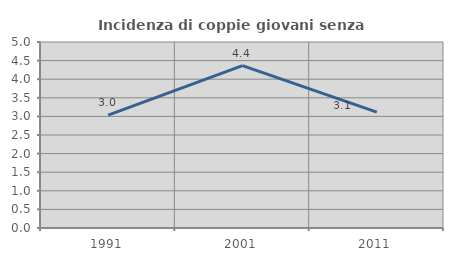
| Category | Incidenza di coppie giovani senza figli |
|---|---|
| 1991.0 | 3.035 |
| 2001.0 | 4.366 |
| 2011.0 | 3.117 |